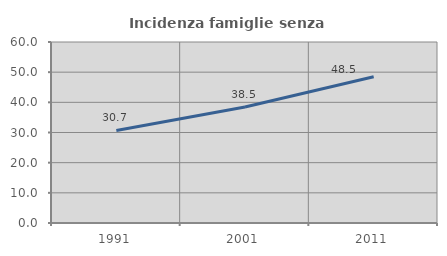
| Category | Incidenza famiglie senza nuclei |
|---|---|
| 1991.0 | 30.664 |
| 2001.0 | 38.48 |
| 2011.0 | 48.503 |